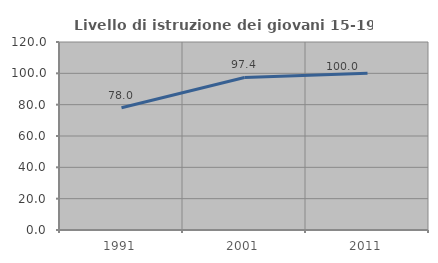
| Category | Livello di istruzione dei giovani 15-19 anni |
|---|---|
| 1991.0 | 78.022 |
| 2001.0 | 97.368 |
| 2011.0 | 100 |